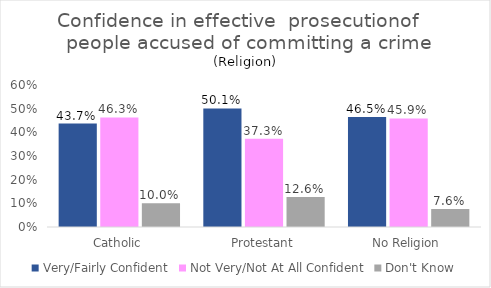
| Category | Very/Fairly Confident | Not Very/Not At All Confident | Don't Know |
|---|---|---|---|
| Catholic | 0.437 | 0.463 | 0.1 |
| Protestant | 0.501 | 0.373 | 0.126 |
| No Religion | 0.465 | 0.459 | 0.076 |